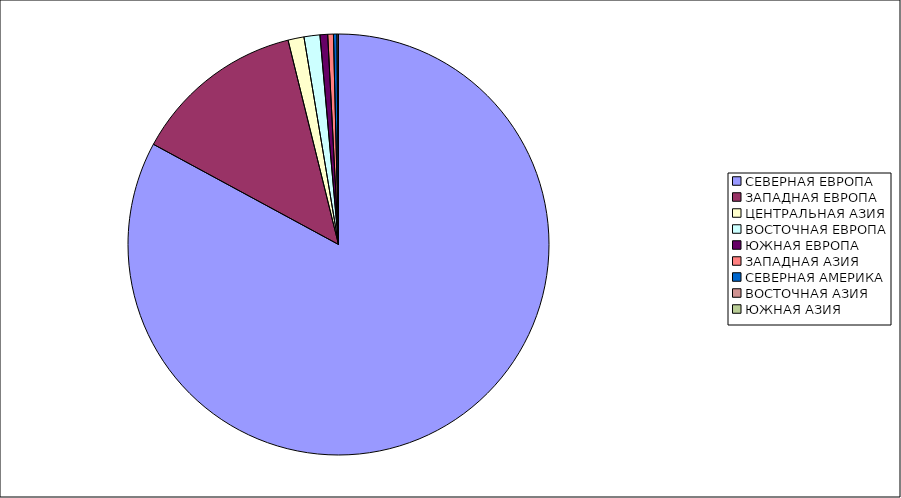
| Category | Оборот |
|---|---|
| СЕВЕРНАЯ ЕВРОПА | 82.897 |
| ЗАПАДНАЯ ЕВРОПА | 13.251 |
| ЦЕНТРАЛЬНАЯ АЗИЯ | 1.225 |
| ВОСТОЧНАЯ ЕВРОПА | 1.221 |
| ЮЖНАЯ ЕВРОПА | 0.589 |
| ЗАПАДНАЯ АЗИЯ | 0.435 |
| СЕВЕРНАЯ АМЕРИКА | 0.269 |
| ВОСТОЧНАЯ АЗИЯ | 0.114 |
| ЮЖНАЯ АЗИЯ | 0 |